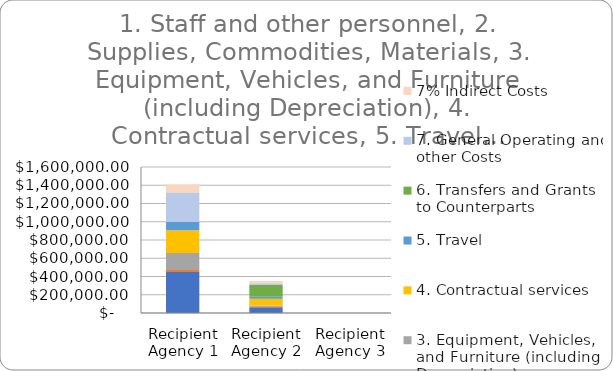
| Category | 1. Staff and other personnel | 2. Supplies, Commodities, Materials | 3. Equipment, Vehicles, and Furniture (including Depreciation) | 4. Contractual services | 5. Travel | 6. Transfers and Grants to Counterparts | 7. General Operating and other Costs |  7% Indirect Costs  |
|---|---|---|---|---|---|---|---|---|
| Recipient Agency 1 | 448050 | 24000 | 185730 | 250054 | 88200 | 0 | 319854 | 92112.16 |
| Recipient Agency 2 | 62905 | 10000 | 10000 | 72197.8 | 22000 | 130000 | 20000 | 22897.196 |
| Recipient Agency 3 | 0 | 0 | 0 | 0 | 0 | 0 | 0 | 0 |